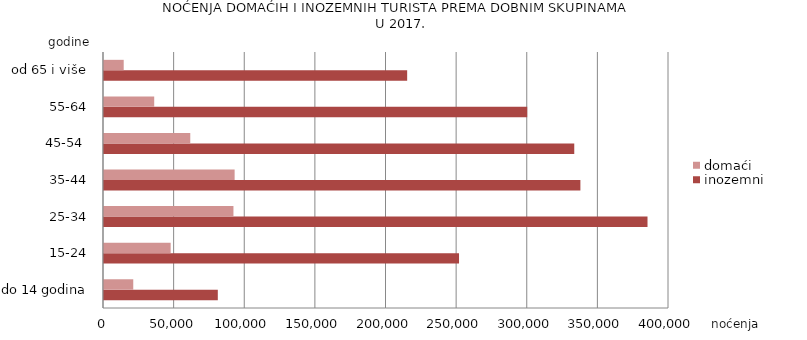
| Category | inozemni | domaći |
|---|---|---|
| do 14 godina | 80570 | 20713 |
| 15-24 | 251347 | 47194 |
| 25-34 | 384787 | 91646 |
| 35-44 | 337271 | 92480 |
| 45-54  | 332926 | 61075 |
| 55-64 | 299623 | 35546 |
| od 65 i više | 214629 | 13951 |